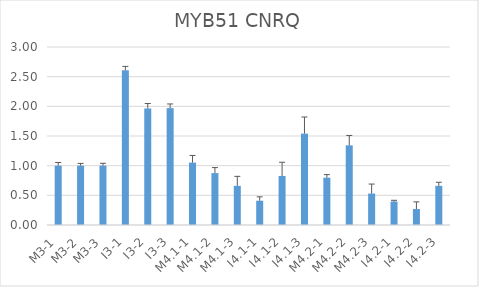
| Category | MYB51 CNRQ |
|---|---|
| M3-1 | 1 |
| M3-2 | 1 |
| M3-3 | 1 |
| I3-1 | 2.607 |
| I3-2 | 1.964 |
| I3-3 | 1.97 |
| M4.1-1 | 1.052 |
| M4.1-2 | 0.875 |
| M4.1-3 | 0.66 |
| I4.1-1 | 0.409 |
| I4.1-2 | 0.827 |
| I4.1-3 | 1.54 |
| M4.2-1 | 0.798 |
| M4.2-2 | 1.343 |
| M4.2-3 | 0.53 |
| I4.2-1 | 0.396 |
| I4.2-2 | 0.269 |
| I4.2-3 | 0.66 |